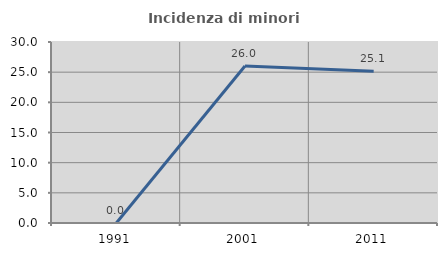
| Category | Incidenza di minori stranieri |
|---|---|
| 1991.0 | 0 |
| 2001.0 | 26.027 |
| 2011.0 | 25.132 |